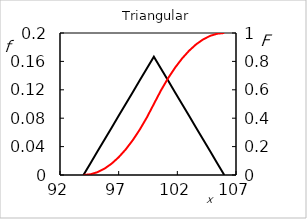
| Category | f |
|---|---|
| 94.0 | 0 |
| 94.6 | 0.017 |
| 95.19999999999999 | 0.033 |
| 95.79999999999998 | 0.05 |
| 96.39999999999998 | 0.067 |
| 96.99999999999997 | 0.083 |
| 97.59999999999997 | 0.1 |
| 98.19999999999996 | 0.117 |
| 98.79999999999995 | 0.133 |
| 99.39999999999995 | 0.15 |
| 99.99999999999994 | 0.167 |
| 100.59999999999994 | 0.15 |
| 101.19999999999993 | 0.133 |
| 101.79999999999993 | 0.117 |
| 102.39999999999992 | 0.1 |
| 102.99999999999991 | 0.083 |
| 103.59999999999991 | 0.067 |
| 104.1999999999999 | 0.05 |
| 104.7999999999999 | 0.033 |
| 105.39999999999989 | 0.017 |
| 105.99999999999989 | 0 |